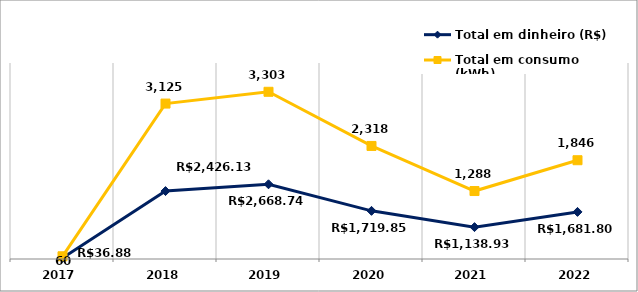
| Category | Total em dinheiro (R$) | Total em consumo (kWh) |
|---|---|---|
| 2017.0 | 36.88 | 60 |
| 2018.0 | 2426.13 | 3125 |
| 2019.0 | 2668.74 | 3303 |
| 2020.0 | 1719.85 | 2318 |
| 2021.0 | 1138.93 | 1288 |
| 2022.0 | 1681.8 | 1846 |